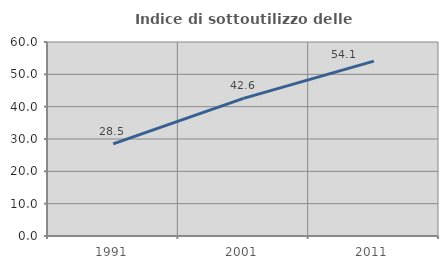
| Category | Indice di sottoutilizzo delle abitazioni  |
|---|---|
| 1991.0 | 28.512 |
| 2001.0 | 42.576 |
| 2011.0 | 54.091 |